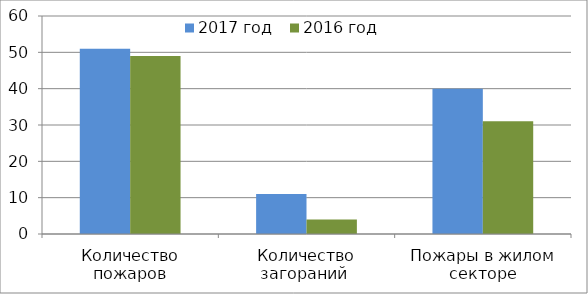
| Category | 2017 год | 2016 год |
|---|---|---|
| Количество пожаров | 51 | 49 |
| Количество загораний  | 11 | 4 |
| Пожары в жилом секторе | 40 | 31 |